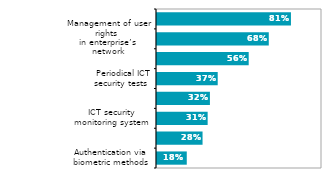
| Category | Series 0 |
|---|---|
| Authentication via biometric methods | 0.18 |
| Authentication based 
on a combination of ≥ 2 mechanisms | 0.276 |
| ICT security monitoring system | 0.307 |
| Encryption of data, documents 
or e-mails | 0.321 |
|  Periodical ICT security tests | 0.368 |
| VPN usage | 0.556 |
| Management of user rights 
in enterprise’s network | 0.677 |
| Data backup to a separate location | 0.812 |